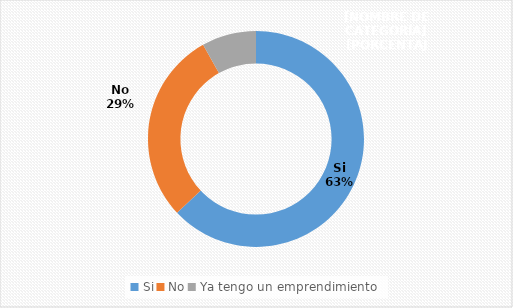
| Category | Series 0 |
|---|---|
| Si | 0.63 |
| No | 0.288 |
| Ya tengo un emprendimiento | 0.082 |